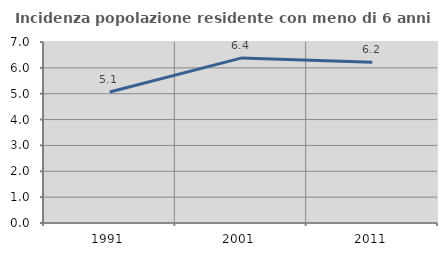
| Category | Incidenza popolazione residente con meno di 6 anni |
|---|---|
| 1991.0 | 5.069 |
| 2001.0 | 6.377 |
| 2011.0 | 6.217 |